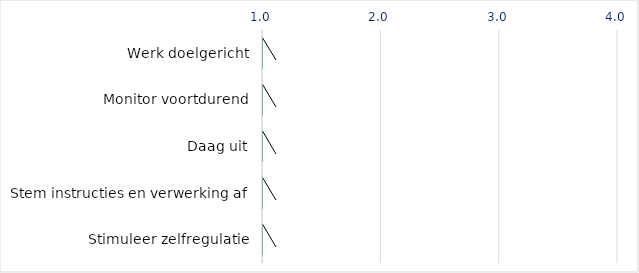
| Category | Series 0 |
|---|---|
| Werk doelgericht | 0 |
| Monitor voortdurend | 0 |
| Daag uit | 0 |
| Stem instructies en verwerking af | 0 |
| Stimuleer zelfregulatie | 0 |